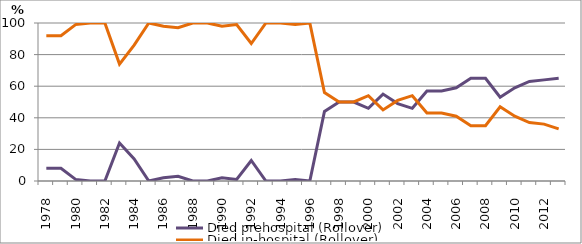
| Category | Died prehospital (Rollover) | Died in-hospital (Rollover) |
|---|---|---|
| 1978.0 | 8 | 92 |
| 1979.0 | 8 | 92 |
| 1980.0 | 1 | 99 |
| 1981.0 | 0 | 100 |
| 1982.0 | 0 | 100 |
| 1983.0 | 24 | 74 |
| 1984.0 | 14 | 86 |
| 1985.0 | 0 | 100 |
| 1986.0 | 2 | 98 |
| 1987.0 | 3 | 97 |
| 1988.0 | 0 | 100 |
| 1989.0 | 0 | 100 |
| 1990.0 | 2 | 98 |
| 1991.0 | 1 | 99 |
| 1992.0 | 13 | 87 |
| 1993.0 | 0 | 100 |
| 1994.0 | 0 | 100 |
| 1995.0 | 1 | 99 |
| 1996.0 | 0 | 100 |
| 1997.0 | 44 | 56 |
| 1998.0 | 50 | 50 |
| 1999.0 | 50 | 50 |
| 2000.0 | 46 | 54 |
| 2001.0 | 55 | 45 |
| 2002.0 | 49 | 51 |
| 2003.0 | 46 | 54 |
| 2004.0 | 57 | 43 |
| 2005.0 | 57 | 43 |
| 2006.0 | 59 | 41 |
| 2007.0 | 65 | 35 |
| 2008.0 | 65 | 35 |
| 2009.0 | 53 | 47 |
| 2010.0 | 59 | 41 |
| 2011.0 | 63 | 37 |
| 2012.0 | 64 | 36 |
| 2013.0 | 65 | 33 |